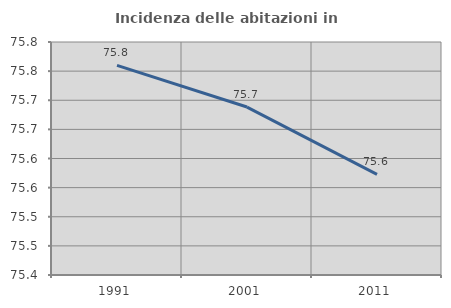
| Category | Incidenza delle abitazioni in proprietà  |
|---|---|
| 1991.0 | 75.76 |
| 2001.0 | 75.688 |
| 2011.0 | 75.573 |